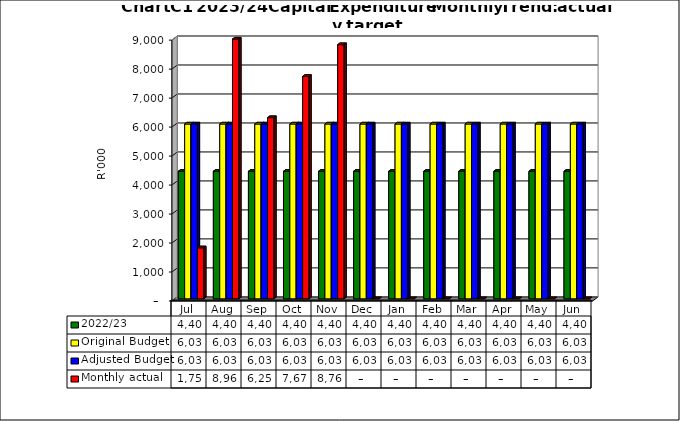
| Category | 2022/23 | Original Budget | Adjusted Budget | Monthly actual |
|---|---|---|---|---|
| Jul | 4399865.68 | 6031695.82 | 6031706 | 1759374.9 |
| Aug | 4399865.68 | 6031695.82 | 6031706 | 8961182.31 |
| Sep | 4399865.68 | 6031695.82 | 6031706 | 6251636.02 |
| Oct | 4399865.68 | 6031695.82 | 6031706 | 7671938.68 |
| Nov | 4399865.68 | 6031695.82 | 6031706 | 8768380.14 |
| Dec | 4399865.68 | 6031695.82 | 6031706 | 0 |
| Jan | 4399865.68 | 6031695.82 | 6031706 | 0 |
| Feb | 4399865.68 | 6031695.82 | 6031706 | 0 |
| Mar | 4399865.68 | 6031695.82 | 6031706 | 0 |
| Apr | 4399865.68 | 6031695.82 | 6031706 | 0 |
| May | 4399865.68 | 6031695.82 | 6031706 | 0 |
| Jun | 4399865.58 | 6031695.98 | 6031584 | 0 |